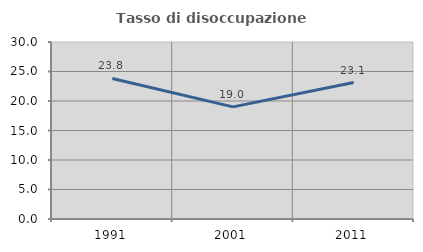
| Category | Tasso di disoccupazione giovanile  |
|---|---|
| 1991.0 | 23.827 |
| 2001.0 | 19.005 |
| 2011.0 | 23.121 |